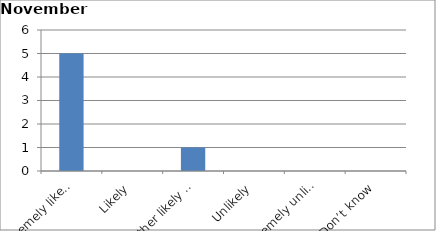
| Category | Series 0 |
|---|---|
| Extremely likely | 5 |
| Likely | 0 |
| Neither likely nor unlikely | 1 |
| Unlikely | 0 |
| Extremely unlikely | 0 |
| Don’t know | 0 |